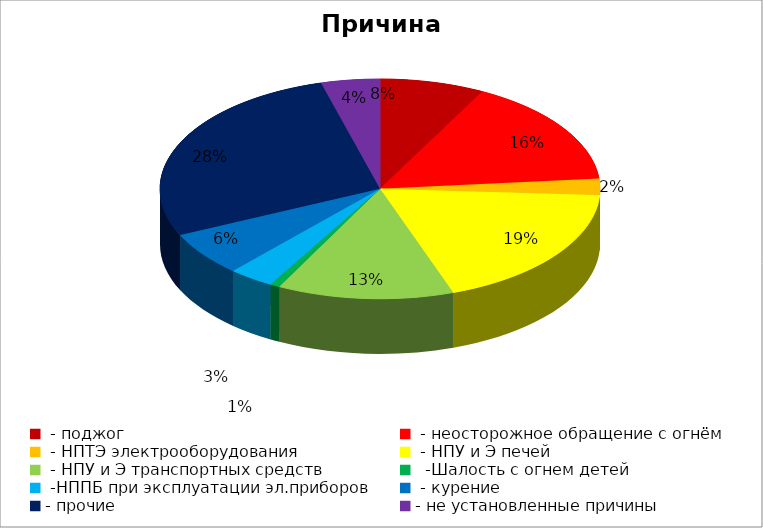
| Category | Причина пожара |
|---|---|
|  - поджог | 32 |
|  - неосторожное обращение с огнём | 66 |
|  - НПТЭ электрооборудования | 10 |
|  - НПУ и Э печей | 78 |
|  - НПУ и Э транспортных средств | 54 |
|   -Шалость с огнем детей | 3 |
|  -НППБ при эксплуатации эл.приборов | 14 |
|  - курение | 27 |
| - прочие | 115 |
| - не установленные причины | 18 |